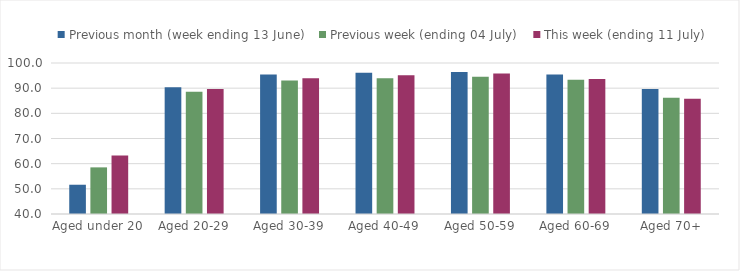
| Category | Previous month (week ending 13 June) | Previous week (ending 04 July) | This week (ending 11 July) |
|---|---|---|---|
| Aged under 20 | 51.629 | 58.526 | 63.249 |
| Aged 20-29 | 90.317 | 88.621 | 89.645 |
| Aged 30-39 | 95.387 | 93.023 | 93.943 |
| Aged 40-49 | 96.107 | 93.892 | 95.096 |
| Aged 50-59 | 96.42 | 94.506 | 95.795 |
| Aged 60-69 | 95.383 | 93.369 | 93.596 |
| Aged 70+ | 89.693 | 86.184 | 85.783 |